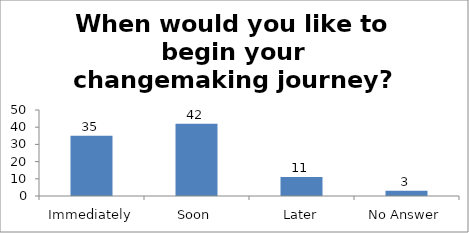
| Category | When would you like to begin your changemaking journey?  |
|---|---|
| Immediately | 35 |
| Soon | 42 |
| Later | 11 |
| No Answer | 3 |